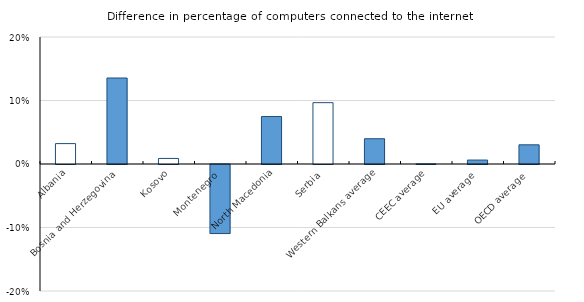
| Category | Series 0 |
|---|---|
| Albania | 0.032 |
| Bosnia and Herzegovina | 0.135 |
| Kosovo | 0.009 |
| Montenegro | -0.109 |
| North Macedonia | 0.075 |
| Serbia | 0.097 |
| Western Balkans average | 0.04 |
| CEEC average | 0 |
| EU average | 0.006 |
| OECD average | 0.03 |